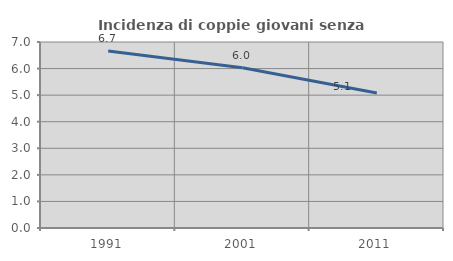
| Category | Incidenza di coppie giovani senza figli |
|---|---|
| 1991.0 | 6.661 |
| 2001.0 | 6.027 |
| 2011.0 | 5.077 |